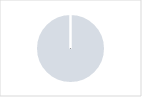
| Category | Series 0 |
|---|---|
| 0 | 0 |
| 1 | 3 |